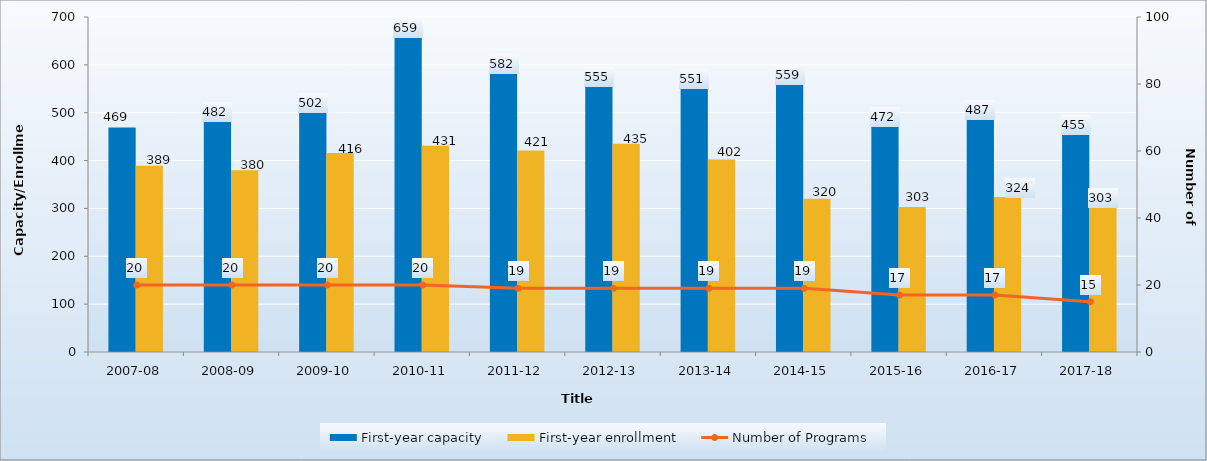
| Category | First-year capacity | First-year enrollment |
|---|---|---|
| 2007-08 | 469 | 389 |
| 2008-09 | 482 | 380 |
| 2009-10 | 502 | 416 |
| 2010-11 | 659 | 431 |
| 2011-12 | 582 | 421 |
| 2012-13 | 555 | 435 |
| 2013-14 | 551 | 402 |
| 2014-15 | 559 | 320 |
| 2015-16 | 472 | 303 |
| 2016-17 | 487 | 324 |
| 2017-18 | 455 | 303 |